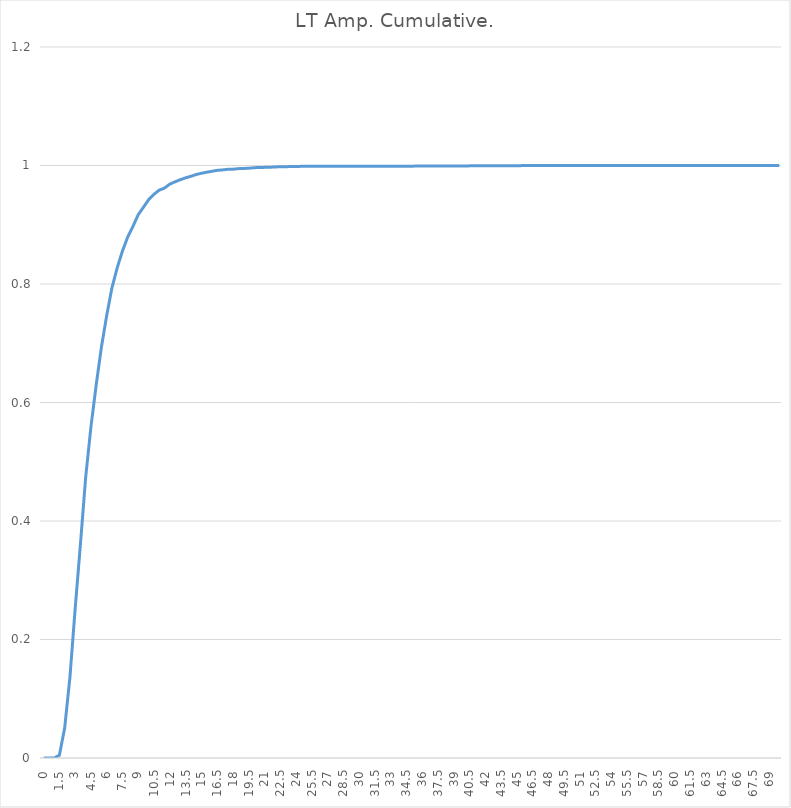
| Category | Series 0 |
|---|---|
| 0.0 | 0 |
| 0.5 | 0 |
| 1.0 | 0 |
| 1.5 | 0.005 |
| 2.0 | 0.05 |
| 2.5 | 0.136 |
| 3.0 | 0.252 |
| 3.5 | 0.36 |
| 4.0 | 0.474 |
| 4.5 | 0.559 |
| 5.0 | 0.63 |
| 5.5 | 0.694 |
| 6.0 | 0.747 |
| 6.5 | 0.794 |
| 7.0 | 0.827 |
| 7.5 | 0.856 |
| 8.0 | 0.879 |
| 8.5 | 0.897 |
| 9.0 | 0.917 |
| 9.5 | 0.93 |
| 10.0 | 0.942 |
| 10.5 | 0.951 |
| 11.0 | 0.958 |
| 11.5 | 0.962 |
| 12.0 | 0.969 |
| 12.5 | 0.972 |
| 13.0 | 0.976 |
| 13.5 | 0.979 |
| 14.0 | 0.982 |
| 14.5 | 0.985 |
| 15.0 | 0.987 |
| 15.5 | 0.989 |
| 16.0 | 0.99 |
| 16.5 | 0.992 |
| 17.0 | 0.993 |
| 17.5 | 0.994 |
| 18.0 | 0.994 |
| 18.5 | 0.995 |
| 19.0 | 0.995 |
| 19.5 | 0.995 |
| 20.0 | 0.996 |
| 20.5 | 0.997 |
| 21.0 | 0.997 |
| 21.5 | 0.997 |
| 22.0 | 0.998 |
| 22.5 | 0.998 |
| 23.0 | 0.998 |
| 23.5 | 0.998 |
| 24.0 | 0.998 |
| 24.5 | 0.999 |
| 25.0 | 0.999 |
| 25.5 | 0.999 |
| 26.0 | 0.999 |
| 26.5 | 0.999 |
| 27.0 | 0.999 |
| 27.5 | 0.999 |
| 28.0 | 0.999 |
| 28.5 | 0.999 |
| 29.0 | 0.999 |
| 29.5 | 0.999 |
| 30.0 | 0.999 |
| 30.5 | 0.999 |
| 31.0 | 0.999 |
| 31.5 | 0.999 |
| 32.0 | 0.999 |
| 32.5 | 0.999 |
| 33.0 | 0.999 |
| 33.5 | 0.999 |
| 34.0 | 0.999 |
| 34.5 | 0.999 |
| 35.0 | 0.999 |
| 35.5 | 0.999 |
| 36.0 | 0.999 |
| 36.5 | 0.999 |
| 37.0 | 0.999 |
| 37.5 | 0.999 |
| 38.0 | 0.999 |
| 38.5 | 0.999 |
| 39.0 | 0.999 |
| 39.5 | 0.999 |
| 40.0 | 0.999 |
| 40.5 | 0.999 |
| 41.0 | 0.999 |
| 41.5 | 0.999 |
| 42.0 | 0.999 |
| 42.5 | 0.999 |
| 43.0 | 0.999 |
| 43.5 | 0.999 |
| 44.0 | 0.999 |
| 44.5 | 0.999 |
| 45.0 | 0.999 |
| 45.5 | 1 |
| 46.0 | 1 |
| 46.5 | 1 |
| 47.0 | 1 |
| 47.5 | 1 |
| 48.0 | 1 |
| 48.5 | 1 |
| 49.0 | 1 |
| 49.5 | 1 |
| 50.0 | 1 |
| 50.5 | 1 |
| 51.0 | 1 |
| 51.5 | 1 |
| 52.0 | 1 |
| 52.5 | 1 |
| 53.0 | 1 |
| 53.5 | 1 |
| 54.0 | 1 |
| 54.5 | 1 |
| 55.0 | 1 |
| 55.5 | 1 |
| 56.0 | 1 |
| 56.5 | 1 |
| 57.0 | 1 |
| 57.5 | 1 |
| 58.0 | 1 |
| 58.5 | 1 |
| 59.0 | 1 |
| 59.5 | 1 |
| 60.0 | 1 |
| 60.5 | 1 |
| 61.0 | 1 |
| 61.5 | 1 |
| 62.0 | 1 |
| 62.5 | 1 |
| 63.0 | 1 |
| 63.5 | 1 |
| 64.0 | 1 |
| 64.5 | 1 |
| 65.0 | 1 |
| 65.5 | 1 |
| 66.0 | 1 |
| 66.5 | 1 |
| 67.0 | 1 |
| 67.5 | 1 |
| 68.0 | 1 |
| 68.5 | 1 |
| 69.0 | 1 |
| 69.5 | 1 |
| 70.0 | 1 |